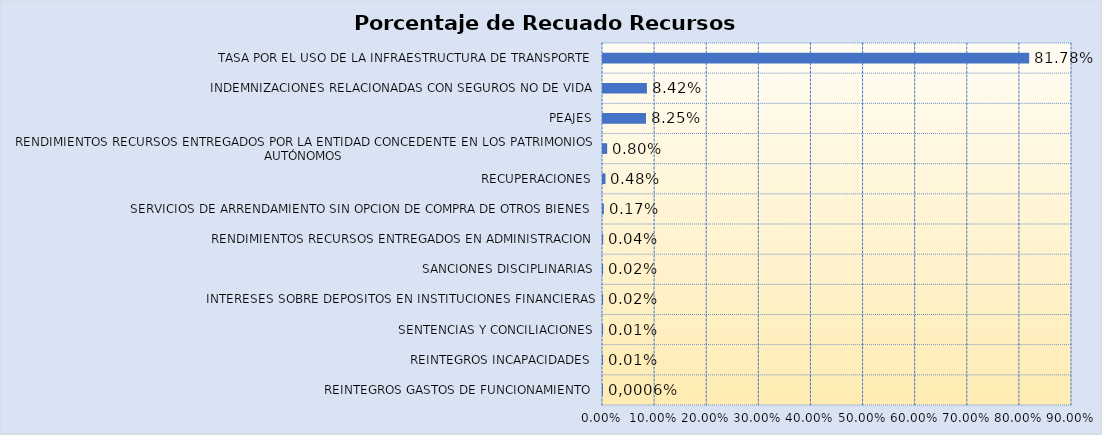
| Category | Total |
|---|---|
| REINTEGROS GASTOS DE FUNCIONAMIENTO | 0 |
| REINTEGROS INCAPACIDADES | 0 |
| SENTENCIAS Y CONCILIACIONES | 0 |
| INTERESES SOBRE DEPOSITOS EN INSTITUCIONES FINANCIERAS | 0 |
| SANCIONES DISCIPLINARIAS | 0 |
| RENDIMIENTOS RECURSOS ENTREGADOS EN ADMINISTRACION | 0 |
| SERVICIOS DE ARRENDAMIENTO SIN OPCION DE COMPRA DE OTROS BIENES | 0.002 |
| RECUPERACIONES | 0.005 |
| RENDIMIENTOS RECURSOS ENTREGADOS POR LA ENTIDAD CONCEDENTE EN LOS PATRIMONIOS AUTÓNOMOS | 0.008 |
| PEAJES | 0.082 |
| INDEMNIZACIONES RELACIONADAS CON SEGUROS NO DE VIDA | 0.084 |
| TASA POR EL USO DE LA INFRAESTRUCTURA DE TRANSPORTE | 0.818 |